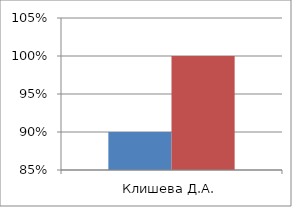
| Category | Series 0 | 2 |
|---|---|---|
| Клишева Д.А. | 0.9 | 1 |